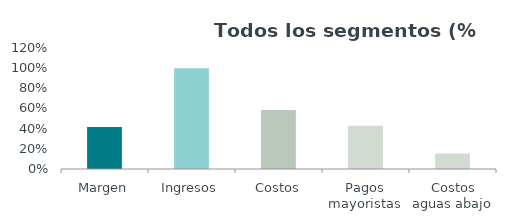
| Category | Series 0 |
|---|---|
| Margen | 0.416 |
| Ingresos | 1 |
| Costos | 0.584 |
| Pagos mayoristas | 0.43 |
| Costos aguas abajo | 0.154 |